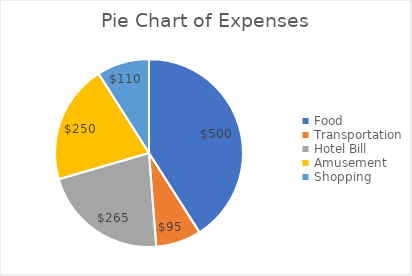
| Category | Amount |
|---|---|
| Food | 500 |
| Transportation | 95 |
| Hotel Bill | 265 |
| Amusement | 250 |
| Shopping | 110 |